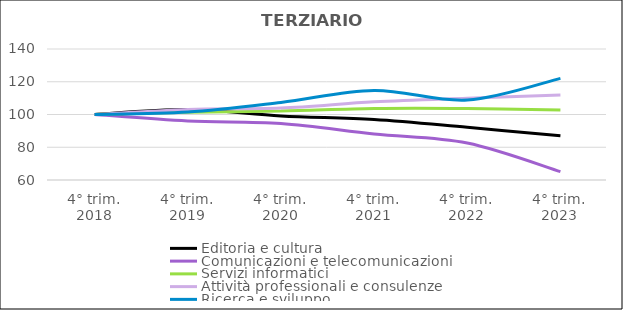
| Category | Editoria e cultura  | Comunicazioni e telecomunicazioni  | Servizi informatici  | Attività professionali e consulenze  | Ricerca e sviluppo |
|---|---|---|---|---|---|
| 4° trim.
2018 | 100 | 100 | 100 | 100 | 100 |
| 4° trim.
2019 | 103.043 | 96.032 | 101.433 | 103.078 | 101.471 |
| 4° trim.
2020 | 99.13 | 94.444 | 102.095 | 103.951 | 107.353 |
| 4° trim.
2021 | 96.957 | 88.095 | 103.693 | 107.731 | 114.706 |
| 4° trim.
2022 | 92.174 | 82.54 | 103.693 | 109.985 | 108.824 |
| 4° trim.
2023 | 86.957 | 65.079 | 102.701 | 111.924 | 122.059 |